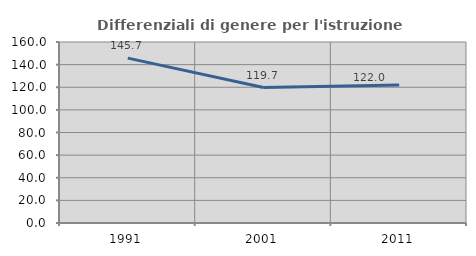
| Category | Differenziali di genere per l'istruzione superiore |
|---|---|
| 1991.0 | 145.738 |
| 2001.0 | 119.748 |
| 2011.0 | 122.019 |